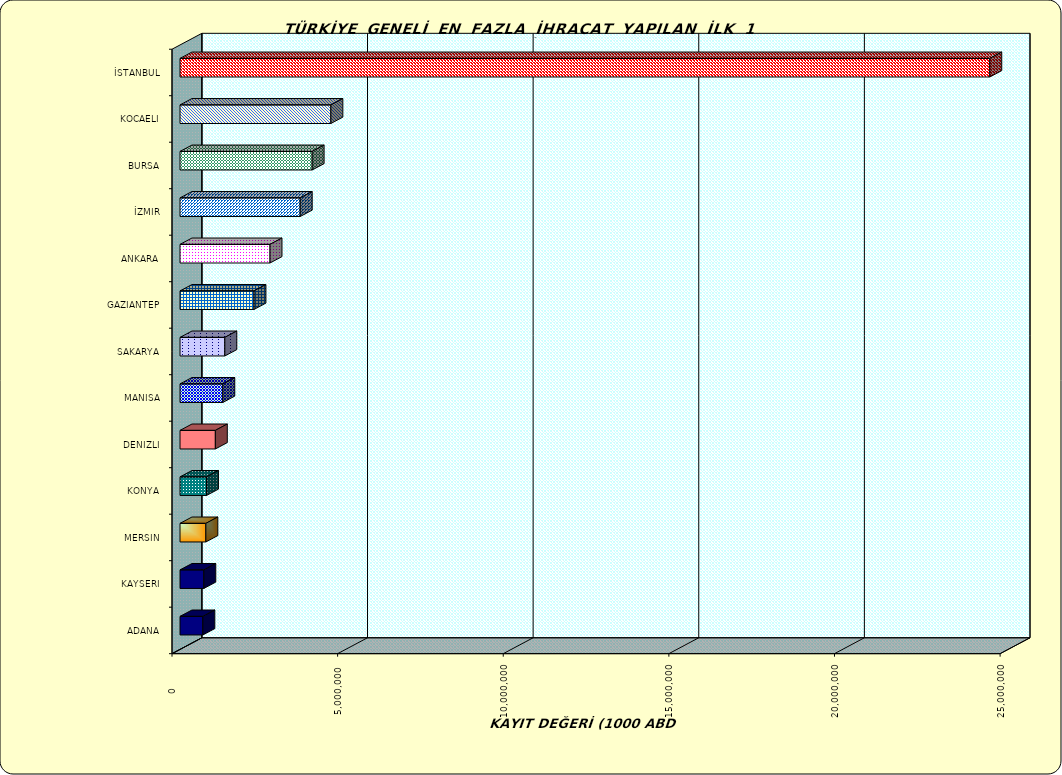
| Category | Series 0 |
|---|---|
| İSTANBUL | 24446204.865 |
| KOCAELI | 4554374.129 |
| BURSA | 3989231.646 |
| İZMIR | 3629055.57 |
| ANKARA | 2716902.783 |
| GAZIANTEP | 2232117.547 |
| SAKARYA | 1352967.045 |
| MANISA | 1291731.673 |
| DENIZLI | 1066700.388 |
| KONYA | 799038.132 |
| MERSIN | 779563.441 |
| KAYSERI | 718281.387 |
| ADANA | 689212.47 |